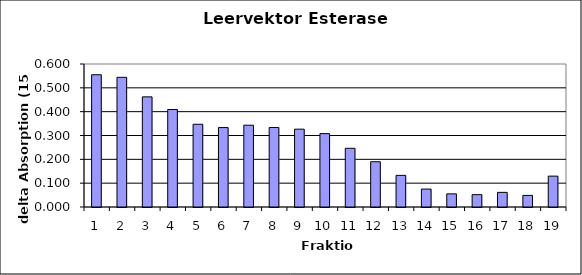
| Category | Series 0 |
|---|---|
| 0 | 0.555 |
| 1 | 0.544 |
| 2 | 0.462 |
| 3 | 0.409 |
| 4 | 0.347 |
| 5 | 0.333 |
| 6 | 0.343 |
| 7 | 0.334 |
| 8 | 0.327 |
| 9 | 0.308 |
| 10 | 0.246 |
| 11 | 0.19 |
| 12 | 0.133 |
| 13 | 0.075 |
| 14 | 0.055 |
| 15 | 0.052 |
| 16 | 0.061 |
| 17 | 0.049 |
| 18 | 0.13 |